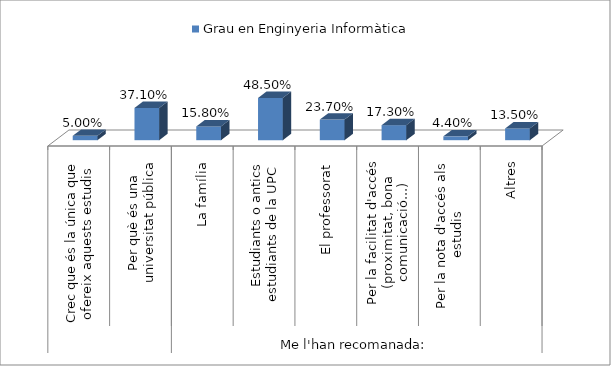
| Category | Grau en Enginyeria Informàtica |
|---|---|
| 0 | 0.05 |
| 1 | 0.371 |
| 2 | 0.158 |
| 3 | 0.485 |
| 4 | 0.237 |
| 5 | 0.173 |
| 6 | 0.044 |
| 7 | 0.135 |